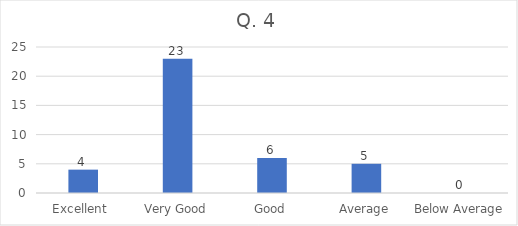
| Category | Series 0 |
|---|---|
| Excellent  | 4 |
| Very Good | 23 |
| Good | 6 |
| Average | 5 |
| Below Average | 0 |